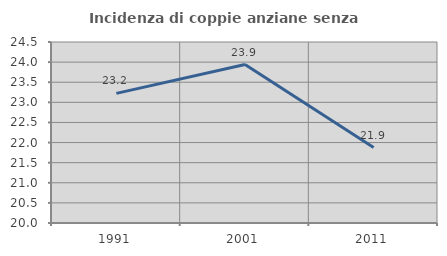
| Category | Incidenza di coppie anziane senza figli  |
|---|---|
| 1991.0 | 23.223 |
| 2001.0 | 23.94 |
| 2011.0 | 21.875 |